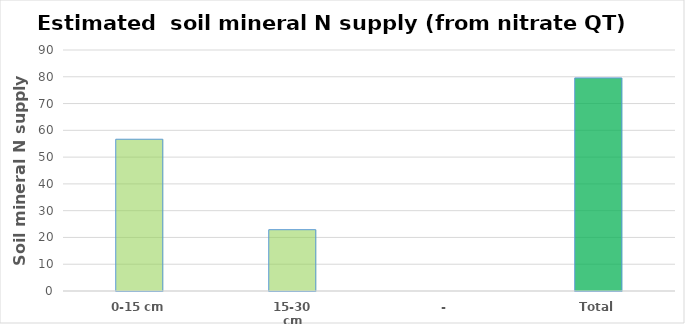
| Category | 0-15 cm | Total |
|---|---|---|
| 0-15 cm | 56.67 | 0 |
| 15-30 cm | 22.893 | 0 |
| - | 0 | 0 |
| Total | 0 | 79.564 |